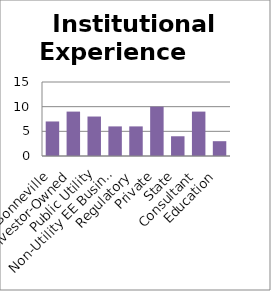
| Category | Institutional Experience |
|---|---|
| Bonneville | 7 |
| Investor-Owned | 9 |
| Public Utility | 8 |
| Non-Utility EE Business | 6 |
| Regulatory | 6 |
| Private | 10 |
| State | 4 |
| Consultant | 9 |
| Education | 3 |